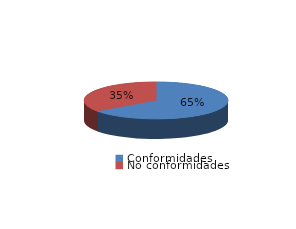
| Category | Series 0 |
|---|---|
| Conformidades | 491 |
| No conformidades | 265 |